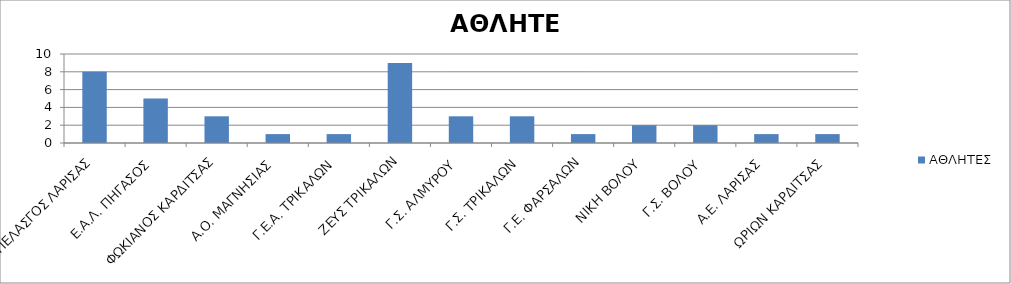
| Category | ΑΘΛΗΤΕΣ |
|---|---|
| ΠΕΛΑΣΓΟΣ ΛΑΡΙΣΑΣ | 8 |
| Ε.Α.Λ. ΠΗΓΑΣΟΣ | 5 |
| ΦΩΚΙΑΝΟΣ ΚΑΡΔΙΤΣΑΣ | 3 |
| Α.Ο. ΜΑΓΝΗΣΙΑΣ | 1 |
| Γ.Ε.Α. ΤΡΙΚΑΛΩΝ | 1 |
| ΖΕΥΣ ΤΡΙΚΑΛΩΝ | 9 |
| Γ.Σ. ΑΛΜΥΡΟΥ | 3 |
| Γ.Σ. ΤΡΙΚΑΛΩΝ | 3 |
| Γ.Ε. ΦΑΡΣΑΛΩΝ | 1 |
| ΝΙΚΗ ΒΟΛΟΥ | 2 |
| Γ.Σ. ΒΟΛΟΥ | 2 |
| Α.Ε. ΛΑΡΙΣΑΣ | 1 |
| ΩΡΙΩΝ ΚΑΡΔΙΤΣΑΣ | 1 |